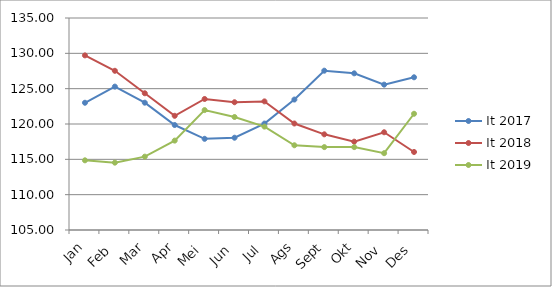
| Category | It 2017 | It 2018 | It 2019 |
|---|---|---|---|
| Jan | 123.006 | 129.71 | 114.86 |
| Feb | 125.289 | 127.53 | 114.53 |
| Mar | 123.015 | 124.35 | 115.38 |
| Apr | 119.856 | 121.16 | 117.65 |
| Mei | 117.903 | 123.54 | 121.97 |
| Jun | 118.059 | 123.08 | 120.99 |
| Jul | 120.062 | 123.2 | 119.63 |
| Ags | 123.459 | 120.07 | 116.99 |
| Sept | 127.544 | 118.54 | 116.73 |
| Okt | 127.168 | 117.5 | 116.73 |
| Nov | 125.572 | 118.83 | 115.87 |
| Des | 126.61 | 116.04 | 121.45 |